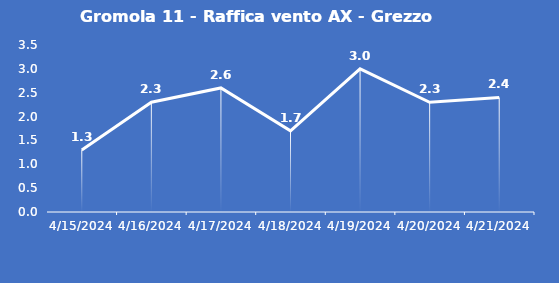
| Category | Gromola 11 - Raffica vento AX - Grezzo (m/s) |
|---|---|
| 4/15/24 | 1.3 |
| 4/16/24 | 2.3 |
| 4/17/24 | 2.6 |
| 4/18/24 | 1.7 |
| 4/19/24 | 3 |
| 4/20/24 | 2.3 |
| 4/21/24 | 2.4 |